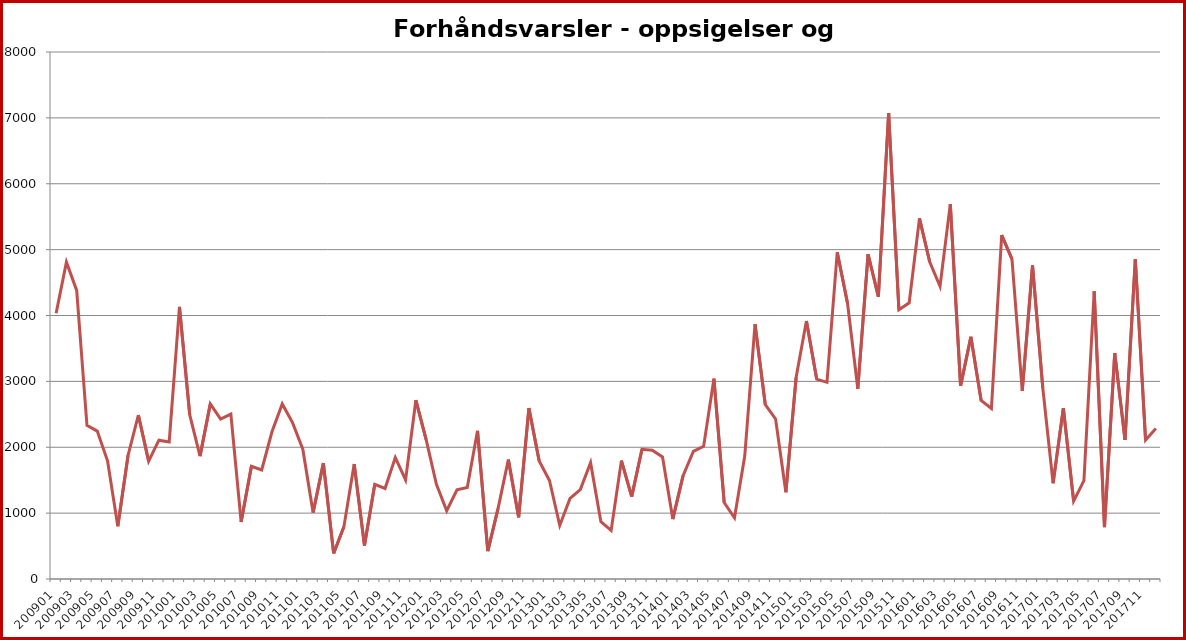
| Category | Series 1 |
|---|---|
| 200901.0 | 4035 |
| 200902.0 | 4810 |
| 200903.0 | 4381 |
| 200904.0 | 2332 |
| 200905.0 | 2245 |
| 200906.0 | 1794 |
| 200907.0 | 802 |
| 200908.0 | 1879 |
| 200909.0 | 2489 |
| 200910.0 | 1789 |
| 200911.0 | 2107 |
| 200912.0 | 2080 |
| 201001.0 | 4130 |
| 201002.0 | 2490 |
| 201003.0 | 1865 |
| 201004.0 | 2658 |
| 201005.0 | 2427 |
| 201006.0 | 2503 |
| 201007.0 | 866 |
| 201008.0 | 1711 |
| 201009.0 | 1655 |
| 201010.0 | 2235 |
| 201011.0 | 2658 |
| 201012.0 | 2374 |
| 201101.0 | 1971 |
| 201102.0 | 1008 |
| 201103.0 | 1759 |
| 201104.0 | 389 |
| 201105.0 | 794 |
| 201106.0 | 1744 |
| 201107.0 | 509 |
| 201108.0 | 1436 |
| 201109.0 | 1374 |
| 201110.0 | 1844 |
| 201111.0 | 1504 |
| 201112.0 | 2714 |
| 201201.0 | 2115 |
| 201202.0 | 1437 |
| 201203.0 | 1037 |
| 201204.0 | 1355 |
| 201205.0 | 1390 |
| 201206.0 | 2249 |
| 201207.0 | 423 |
| 201208.0 | 1073 |
| 201209.0 | 1812 |
| 201210.0 | 937 |
| 201211.0 | 2594 |
| 201212.0 | 1792 |
| 201301.0 | 1496 |
| 201302.0 | 813 |
| 201303.0 | 1223 |
| 201304.0 | 1358 |
| 201305.0 | 1765 |
| 201306.0 | 869 |
| 201307.0 | 738 |
| 201308.0 | 1797 |
| 201309.0 | 1250 |
| 201310.0 | 1969 |
| 201311.0 | 1954 |
| 201312.0 | 1853 |
| 201401.0 | 910 |
| 201402.0 | 1568 |
| 201403.0 | 1937 |
| 201404.0 | 2014 |
| 201405.0 | 3040 |
| 201406.0 | 1160 |
| 201407.0 | 929 |
| 201408.0 | 1866 |
| 201409.0 | 3868 |
| 201410.0 | 2646 |
| 201411.0 | 2429 |
| 201412.0 | 1317 |
| 201501.0 | 3062 |
| 201502.0 | 3915 |
| 201503.0 | 3035 |
| 201504.0 | 2985 |
| 201505.0 | 4960 |
| 201506.0 | 4185 |
| 201507.0 | 2888 |
| 201508.0 | 4930 |
| 201509.0 | 4286 |
| 201510.0 | 7072 |
| 201511.0 | 4087 |
| 201512.0 | 4193 |
| 201601.0 | 5475 |
| 201602.0 | 4812 |
| 201603.0 | 4444 |
| 201604.0 | 5691 |
| 201605.0 | 2931 |
| 201606.0 | 3676 |
| 201607.0 | 2709 |
| 201608.0 | 2588 |
| 201609.0 | 5220 |
| 201610.0 | 4857 |
| 201611.0 | 2855 |
| 201612.0 | 4761 |
| 201701.0 | 2898 |
| 201702.0 | 1454 |
| 201703.0 | 2594 |
| 201704.0 | 1182 |
| 201705.0 | 1494 |
| 201706.0 | 4368 |
| 201707.0 | 787 |
| 201708.0 | 3429 |
| 201709.0 | 2112 |
| 201710.0 | 4854 |
| 201711.0 | 2109 |
| 201712.0 | 2284 |